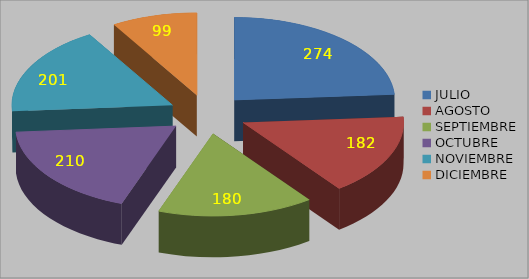
| Category | Series 0 |
|---|---|
| JULIO | 274 |
| AGOSTO | 182 |
| SEPTIEMBRE | 180 |
| OCTUBRE | 210 |
| NOVIEMBRE | 201 |
| DICIEMBRE | 99 |